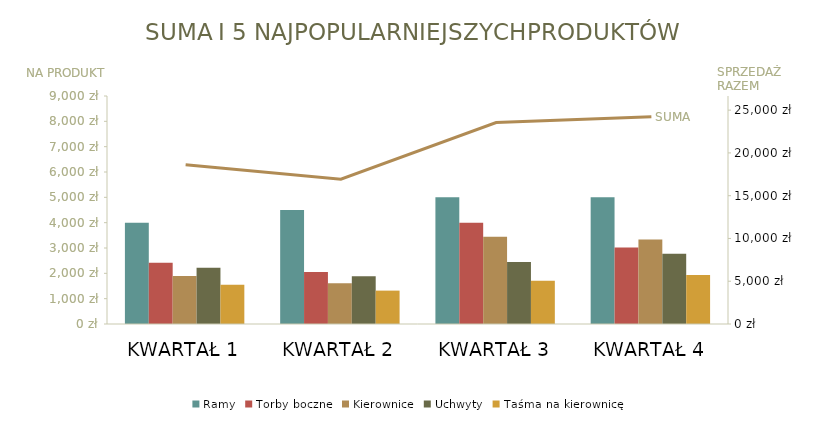
| Category | Ramy | Torby boczne | Kierownice | Uchwyty | Taśma na kierownicę |
|---|---|---|---|---|---|
| KWARTAŁ 1 | 4000 | 2413 | 1895 | 2222 | 1550.4 |
| KWARTAŁ 2 | 4500 | 2051.05 | 1610.75 | 1888.7 | 1317.84 |
| KWARTAŁ 3 | 5000 | 4000 | 3445 | 2444.2 | 1705.44 |
| KWARTAŁ 4 | 5000 | 3016.25 | 3333 | 2777.5 | 1938 |